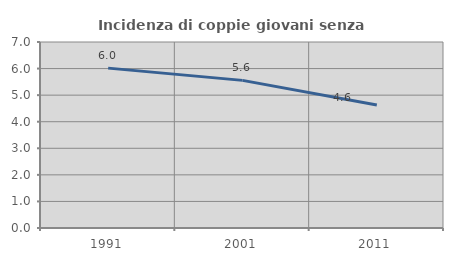
| Category | Incidenza di coppie giovani senza figli |
|---|---|
| 1991.0 | 6.017 |
| 2001.0 | 5.556 |
| 2011.0 | 4.632 |